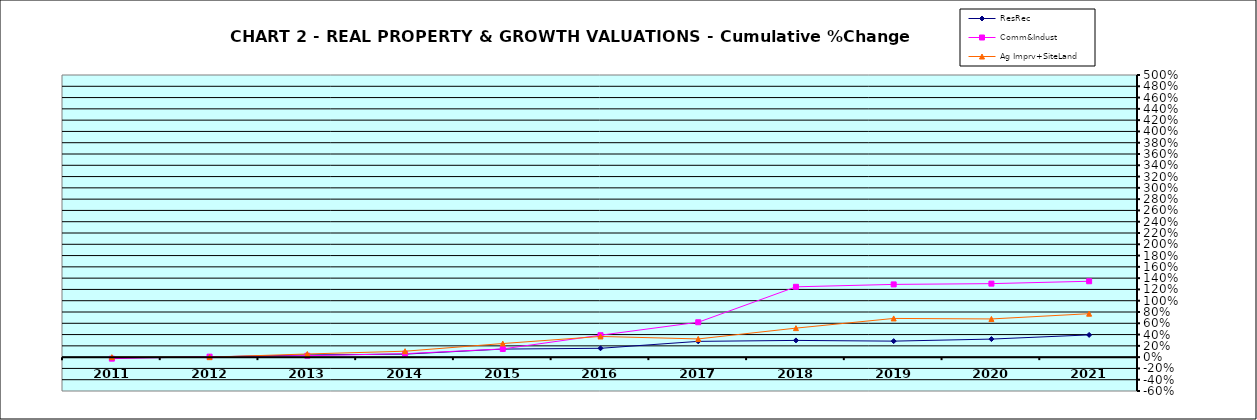
| Category | ResRec | Comm&Indust | Ag Imprv+SiteLand |
|---|---|---|---|
| 2011.0 | -0.011 | -0.027 | 0 |
| 2012.0 | 0.003 | 0.009 | 0 |
| 2013.0 | 0.039 | 0.025 | 0.056 |
| 2014.0 | 0.054 | 0.062 | 0.105 |
| 2015.0 | 0.143 | 0.145 | 0.241 |
| 2016.0 | 0.157 | 0.389 | 0.367 |
| 2017.0 | 0.279 | 0.618 | 0.323 |
| 2018.0 | 0.296 | 1.246 | 0.514 |
| 2019.0 | 0.284 | 1.289 | 0.686 |
| 2020.0 | 0.32 | 1.303 | 0.677 |
| 2021.0 | 0.394 | 1.345 | 0.77 |